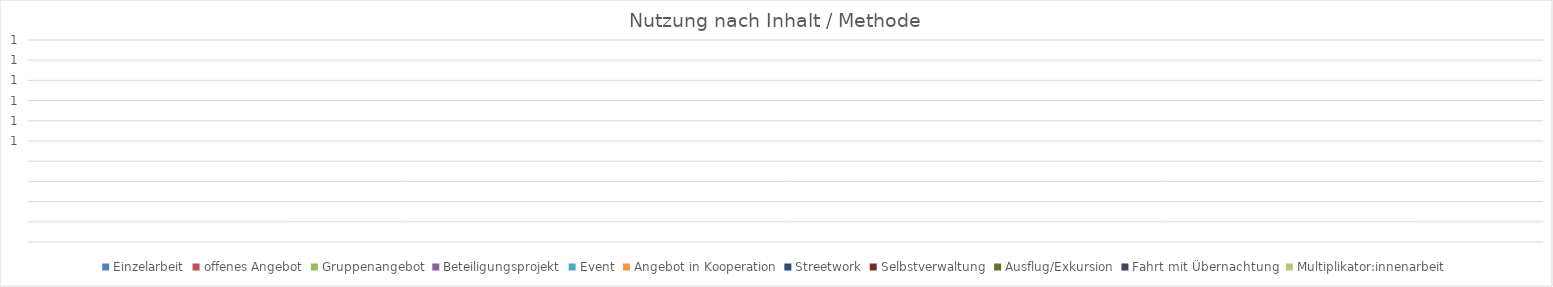
| Category | Einzelarbeit | offenes Angebot | Gruppenangebot | Beteiligungsprojekt | Event | Angebot in Kooperation | Streetwork | Selbstverwaltung | Ausflug/Exkursion | Fahrt mit Übernachtung | Multiplikator:innenarbeit |
|---|---|---|---|---|---|---|---|---|---|---|---|
| 0 | 0 | 0 | 0 | 0 | 0 | 0 | 0 | 0 | 0 | 0 | 0 |